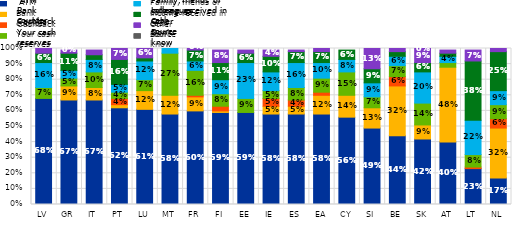
| Category | ATM | Bank counter | Cashback | Your cash reserves | Family, friends or colleagues | Income received in cash | Other source | Don't know |
|---|---|---|---|---|---|---|---|---|
| LV | 0.68 | 0 | 0 | 0.07 | 0.16 | 0.06 | 0.03 | 0 |
| GR | 0.67 | 0.09 | 0 | 0.05 | 0.05 | 0.11 | 0.02 | 0 |
| IT | 0.67 | 0.08 | 0 | 0.1 | 0.08 | 0.03 | 0.03 | 0 |
| PT | 0.62 | 0.02 | 0.04 | 0.04 | 0.05 | 0.16 | 0.07 | 0 |
| LU | 0.61 | 0.12 | 0 | 0.07 | 0.12 | 0.02 | 0.06 | 0 |
| MT | 0.58 | 0.12 | 0 | 0.27 | 0.03 | 0 | 0 | 0 |
| FR | 0.6 | 0.09 | 0.01 | 0.16 | 0.06 | 0.07 | 0.02 | 0 |
| FI | 0.59 | 0.01 | 0.03 | 0.08 | 0.09 | 0.11 | 0.08 | 0 |
| EE | 0.59 | 0 | 0 | 0.09 | 0.23 | 0.06 | 0.02 | 0 |
| IE | 0.58 | 0.05 | 0.05 | 0.05 | 0.12 | 0.1 | 0.04 | 0 |
| ES | 0.58 | 0.05 | 0.04 | 0.08 | 0.16 | 0.07 | 0.01 | 0 |
| EA | 0.58 | 0.12 | 0.02 | 0.09 | 0.1 | 0.07 | 0.03 | 0 |
| CY | 0.56 | 0.14 | 0 | 0.15 | 0.08 | 0.06 | 0 | 0 |
| SI | 0.49 | 0.13 | 0 | 0.07 | 0.09 | 0.09 | 0.13 | 0 |
| BE | 0.44 | 0.32 | 0.06 | 0.07 | 0.06 | 0.03 | 0.02 | 0 |
| SK | 0.42 | 0.09 | 0 | 0.14 | 0.2 | 0.06 | 0.09 | 0 |
| AT | 0.4 | 0.48 | 0 | 0.03 | 0.04 | 0.02 | 0.02 | 0 |
| LT | 0.23 | 0 | 0.01 | 0.08 | 0.22 | 0.38 | 0.07 | 0 |
| NL | 0.17 | 0.32 | 0.06 | 0.09 | 0.09 | 0.25 | 0.02 | 0 |